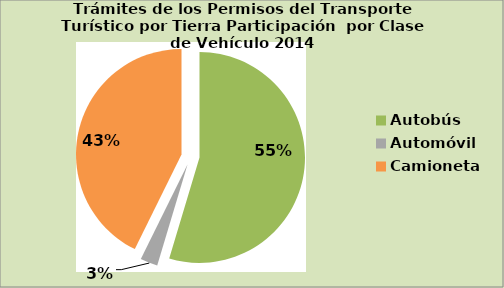
| Category | Series 0 |
|---|---|
| Autobús | 54.636 |
| Automóvil | 2.659 |
| Camioneta | 42.705 |